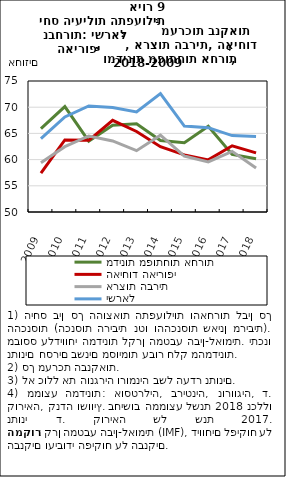
| Category | מדינות מפותחות אחרות | האיחוד האירופי | ארצות הברית | ישראל |
|---|---|---|---|---|
| 2009.0 | 65.903 | 57.426 | 59.378 | 64.019 |
| 2010.0 | 70.126 | 63.744 | 62.467 | 68.14 |
| 2011.0 | 63.532 | 63.677 | 64.511 | 70.233 |
| 2012.0 | 66.558 | 67.484 | 63.56 | 69.945 |
| 2013.0 | 66.823 | 65.363 | 61.71 | 69.081 |
| 2014.0 | 63.654 | 62.455 | 64.658 | 72.599 |
| 2015.0 | 63.228 | 60.902 | 60.686 | 66.395 |
| 2016.0 | 66.361 | 59.953 | 59.553 | 66.09 |
| 2017.0 | 60.994 | 62.636 | 61.573 | 64.581 |
| 2018.0 | 60.155 | 61.277 | 58.417 | 64.431 |